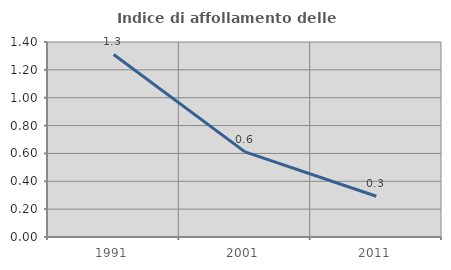
| Category | Indice di affollamento delle abitazioni  |
|---|---|
| 1991.0 | 1.31 |
| 2001.0 | 0.611 |
| 2011.0 | 0.293 |